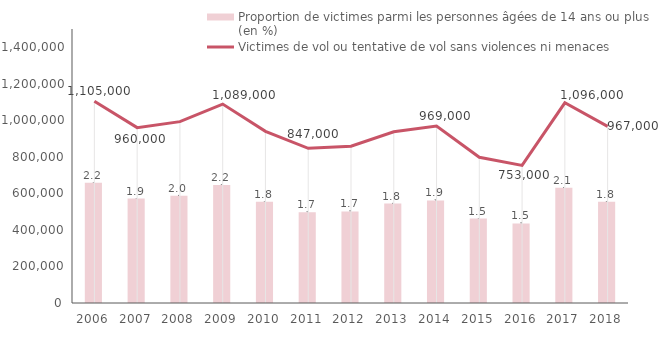
| Category | Proportion de victimes parmi les personnes âgées de 14 ans ou plus (en %) |
|---|---|
| 2006.0 | 2.196 |
| 2007.0 | 1.906 |
| 2008.0 | 1.957 |
| 2009.0 | 2.154 |
| 2010.0 | 1.848 |
| 2011.0 | 1.658 |
| 2012.0 | 1.671 |
| 2013.0 | 1.816 |
| 2014.0 | 1.872 |
| 2015.0 | 1.542 |
| 2016.0 | 1.453 |
| 2017.0 | 2.102 |
| 2018.0 | 1.846 |